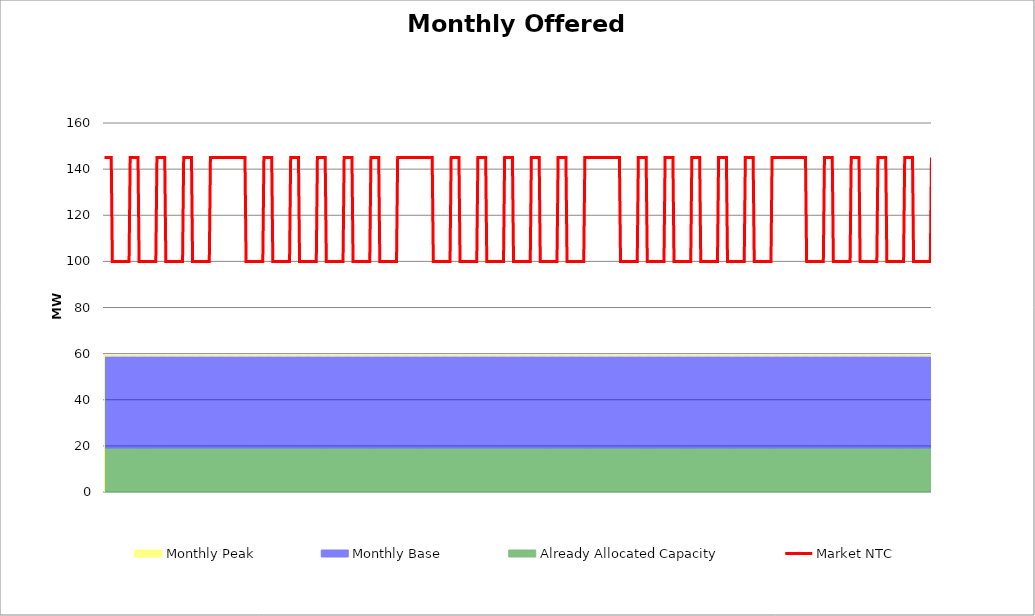
| Category | Market NTC |
|---|---|
| 0 | 145 |
| 1 | 145 |
| 2 | 145 |
| 3 | 145 |
| 4 | 145 |
| 5 | 145 |
| 6 | 145 |
| 7 | 100 |
| 8 | 100 |
| 9 | 100 |
| 10 | 100 |
| 11 | 100 |
| 12 | 100 |
| 13 | 100 |
| 14 | 100 |
| 15 | 100 |
| 16 | 100 |
| 17 | 100 |
| 18 | 100 |
| 19 | 100 |
| 20 | 100 |
| 21 | 100 |
| 22 | 100 |
| 23 | 145 |
| 24 | 145 |
| 25 | 145 |
| 26 | 145 |
| 27 | 145 |
| 28 | 145 |
| 29 | 145 |
| 30 | 145 |
| 31 | 100 |
| 32 | 100 |
| 33 | 100 |
| 34 | 100 |
| 35 | 100 |
| 36 | 100 |
| 37 | 100 |
| 38 | 100 |
| 39 | 100 |
| 40 | 100 |
| 41 | 100 |
| 42 | 100 |
| 43 | 100 |
| 44 | 100 |
| 45 | 100 |
| 46 | 100 |
| 47 | 145 |
| 48 | 145 |
| 49 | 145 |
| 50 | 145 |
| 51 | 145 |
| 52 | 145 |
| 53 | 145 |
| 54 | 145 |
| 55 | 100 |
| 56 | 100 |
| 57 | 100 |
| 58 | 100 |
| 59 | 100 |
| 60 | 100 |
| 61 | 100 |
| 62 | 100 |
| 63 | 100 |
| 64 | 100 |
| 65 | 100 |
| 66 | 100 |
| 67 | 100 |
| 68 | 100 |
| 69 | 100 |
| 70 | 100 |
| 71 | 145 |
| 72 | 145 |
| 73 | 145 |
| 74 | 145 |
| 75 | 145 |
| 76 | 145 |
| 77 | 145 |
| 78 | 145 |
| 79 | 100 |
| 80 | 100 |
| 81 | 100 |
| 82 | 100 |
| 83 | 100 |
| 84 | 100 |
| 85 | 100 |
| 86 | 100 |
| 87 | 100 |
| 88 | 100 |
| 89 | 100 |
| 90 | 100 |
| 91 | 100 |
| 92 | 100 |
| 93 | 100 |
| 94 | 100 |
| 95 | 145 |
| 96 | 145 |
| 97 | 145 |
| 98 | 145 |
| 99 | 145 |
| 100 | 145 |
| 101 | 145 |
| 102 | 145 |
| 103 | 145 |
| 104 | 145 |
| 105 | 145 |
| 106 | 145 |
| 107 | 145 |
| 108 | 145 |
| 109 | 145 |
| 110 | 145 |
| 111 | 145 |
| 112 | 145 |
| 113 | 145 |
| 114 | 145 |
| 115 | 145 |
| 116 | 145 |
| 117 | 145 |
| 118 | 145 |
| 119 | 145 |
| 120 | 145 |
| 121 | 145 |
| 122 | 145 |
| 123 | 145 |
| 124 | 145 |
| 125 | 145 |
| 126 | 145 |
| 127 | 100 |
| 128 | 100 |
| 129 | 100 |
| 130 | 100 |
| 131 | 100 |
| 132 | 100 |
| 133 | 100 |
| 134 | 100 |
| 135 | 100 |
| 136 | 100 |
| 137 | 100 |
| 138 | 100 |
| 139 | 100 |
| 140 | 100 |
| 141 | 100 |
| 142 | 100 |
| 143 | 145 |
| 144 | 145 |
| 145 | 145 |
| 146 | 145 |
| 147 | 145 |
| 148 | 145 |
| 149 | 145 |
| 150 | 145 |
| 151 | 100 |
| 152 | 100 |
| 153 | 100 |
| 154 | 100 |
| 155 | 100 |
| 156 | 100 |
| 157 | 100 |
| 158 | 100 |
| 159 | 100 |
| 160 | 100 |
| 161 | 100 |
| 162 | 100 |
| 163 | 100 |
| 164 | 100 |
| 165 | 100 |
| 166 | 100 |
| 167 | 145 |
| 168 | 145 |
| 169 | 145 |
| 170 | 145 |
| 171 | 145 |
| 172 | 145 |
| 173 | 145 |
| 174 | 145 |
| 175 | 100 |
| 176 | 100 |
| 177 | 100 |
| 178 | 100 |
| 179 | 100 |
| 180 | 100 |
| 181 | 100 |
| 182 | 100 |
| 183 | 100 |
| 184 | 100 |
| 185 | 100 |
| 186 | 100 |
| 187 | 100 |
| 188 | 100 |
| 189 | 100 |
| 190 | 100 |
| 191 | 145 |
| 192 | 145 |
| 193 | 145 |
| 194 | 145 |
| 195 | 145 |
| 196 | 145 |
| 197 | 145 |
| 198 | 145 |
| 199 | 100 |
| 200 | 100 |
| 201 | 100 |
| 202 | 100 |
| 203 | 100 |
| 204 | 100 |
| 205 | 100 |
| 206 | 100 |
| 207 | 100 |
| 208 | 100 |
| 209 | 100 |
| 210 | 100 |
| 211 | 100 |
| 212 | 100 |
| 213 | 100 |
| 214 | 100 |
| 215 | 145 |
| 216 | 145 |
| 217 | 145 |
| 218 | 145 |
| 219 | 145 |
| 220 | 145 |
| 221 | 145 |
| 222 | 145 |
| 223 | 100 |
| 224 | 100 |
| 225 | 100 |
| 226 | 100 |
| 227 | 100 |
| 228 | 100 |
| 229 | 100 |
| 230 | 100 |
| 231 | 100 |
| 232 | 100 |
| 233 | 100 |
| 234 | 100 |
| 235 | 100 |
| 236 | 100 |
| 237 | 100 |
| 238 | 100 |
| 239 | 145 |
| 240 | 145 |
| 241 | 145 |
| 242 | 145 |
| 243 | 145 |
| 244 | 145 |
| 245 | 145 |
| 246 | 145 |
| 247 | 100 |
| 248 | 100 |
| 249 | 100 |
| 250 | 100 |
| 251 | 100 |
| 252 | 100 |
| 253 | 100 |
| 254 | 100 |
| 255 | 100 |
| 256 | 100 |
| 257 | 100 |
| 258 | 100 |
| 259 | 100 |
| 260 | 100 |
| 261 | 100 |
| 262 | 100 |
| 263 | 145 |
| 264 | 145 |
| 265 | 145 |
| 266 | 145 |
| 267 | 145 |
| 268 | 145 |
| 269 | 145 |
| 270 | 145 |
| 271 | 145 |
| 272 | 145 |
| 273 | 145 |
| 274 | 145 |
| 275 | 145 |
| 276 | 145 |
| 277 | 145 |
| 278 | 145 |
| 279 | 145 |
| 280 | 145 |
| 281 | 145 |
| 282 | 145 |
| 283 | 145 |
| 284 | 145 |
| 285 | 145 |
| 286 | 145 |
| 287 | 145 |
| 288 | 145 |
| 289 | 145 |
| 290 | 145 |
| 291 | 145 |
| 292 | 145 |
| 293 | 145 |
| 294 | 145 |
| 295 | 100 |
| 296 | 100 |
| 297 | 100 |
| 298 | 100 |
| 299 | 100 |
| 300 | 100 |
| 301 | 100 |
| 302 | 100 |
| 303 | 100 |
| 304 | 100 |
| 305 | 100 |
| 306 | 100 |
| 307 | 100 |
| 308 | 100 |
| 309 | 100 |
| 310 | 100 |
| 311 | 145 |
| 312 | 145 |
| 313 | 145 |
| 314 | 145 |
| 315 | 145 |
| 316 | 145 |
| 317 | 145 |
| 318 | 145 |
| 319 | 100 |
| 320 | 100 |
| 321 | 100 |
| 322 | 100 |
| 323 | 100 |
| 324 | 100 |
| 325 | 100 |
| 326 | 100 |
| 327 | 100 |
| 328 | 100 |
| 329 | 100 |
| 330 | 100 |
| 331 | 100 |
| 332 | 100 |
| 333 | 100 |
| 334 | 100 |
| 335 | 145 |
| 336 | 145 |
| 337 | 145 |
| 338 | 145 |
| 339 | 145 |
| 340 | 145 |
| 341 | 145 |
| 342 | 145 |
| 343 | 100 |
| 344 | 100 |
| 345 | 100 |
| 346 | 100 |
| 347 | 100 |
| 348 | 100 |
| 349 | 100 |
| 350 | 100 |
| 351 | 100 |
| 352 | 100 |
| 353 | 100 |
| 354 | 100 |
| 355 | 100 |
| 356 | 100 |
| 357 | 100 |
| 358 | 100 |
| 359 | 145 |
| 360 | 145 |
| 361 | 145 |
| 362 | 145 |
| 363 | 145 |
| 364 | 145 |
| 365 | 145 |
| 366 | 145 |
| 367 | 100 |
| 368 | 100 |
| 369 | 100 |
| 370 | 100 |
| 371 | 100 |
| 372 | 100 |
| 373 | 100 |
| 374 | 100 |
| 375 | 100 |
| 376 | 100 |
| 377 | 100 |
| 378 | 100 |
| 379 | 100 |
| 380 | 100 |
| 381 | 100 |
| 382 | 100 |
| 383 | 145 |
| 384 | 145 |
| 385 | 145 |
| 386 | 145 |
| 387 | 145 |
| 388 | 145 |
| 389 | 145 |
| 390 | 145 |
| 391 | 100 |
| 392 | 100 |
| 393 | 100 |
| 394 | 100 |
| 395 | 100 |
| 396 | 100 |
| 397 | 100 |
| 398 | 100 |
| 399 | 100 |
| 400 | 100 |
| 401 | 100 |
| 402 | 100 |
| 403 | 100 |
| 404 | 100 |
| 405 | 100 |
| 406 | 100 |
| 407 | 145 |
| 408 | 145 |
| 409 | 145 |
| 410 | 145 |
| 411 | 145 |
| 412 | 145 |
| 413 | 145 |
| 414 | 145 |
| 415 | 100 |
| 416 | 100 |
| 417 | 100 |
| 418 | 100 |
| 419 | 100 |
| 420 | 100 |
| 421 | 100 |
| 422 | 100 |
| 423 | 100 |
| 424 | 100 |
| 425 | 100 |
| 426 | 100 |
| 427 | 100 |
| 428 | 100 |
| 429 | 100 |
| 430 | 100 |
| 431 | 145 |
| 432 | 145 |
| 433 | 145 |
| 434 | 145 |
| 435 | 145 |
| 436 | 145 |
| 437 | 145 |
| 438 | 145 |
| 439 | 145 |
| 440 | 145 |
| 441 | 145 |
| 442 | 145 |
| 443 | 145 |
| 444 | 145 |
| 445 | 145 |
| 446 | 145 |
| 447 | 145 |
| 448 | 145 |
| 449 | 145 |
| 450 | 145 |
| 451 | 145 |
| 452 | 145 |
| 453 | 145 |
| 454 | 145 |
| 455 | 145 |
| 456 | 145 |
| 457 | 145 |
| 458 | 145 |
| 459 | 145 |
| 460 | 145 |
| 461 | 145 |
| 462 | 145 |
| 463 | 100 |
| 464 | 100 |
| 465 | 100 |
| 466 | 100 |
| 467 | 100 |
| 468 | 100 |
| 469 | 100 |
| 470 | 100 |
| 471 | 100 |
| 472 | 100 |
| 473 | 100 |
| 474 | 100 |
| 475 | 100 |
| 476 | 100 |
| 477 | 100 |
| 478 | 100 |
| 479 | 145 |
| 480 | 145 |
| 481 | 145 |
| 482 | 145 |
| 483 | 145 |
| 484 | 145 |
| 485 | 145 |
| 486 | 145 |
| 487 | 100 |
| 488 | 100 |
| 489 | 100 |
| 490 | 100 |
| 491 | 100 |
| 492 | 100 |
| 493 | 100 |
| 494 | 100 |
| 495 | 100 |
| 496 | 100 |
| 497 | 100 |
| 498 | 100 |
| 499 | 100 |
| 500 | 100 |
| 501 | 100 |
| 502 | 100 |
| 503 | 145 |
| 504 | 145 |
| 505 | 145 |
| 506 | 145 |
| 507 | 145 |
| 508 | 145 |
| 509 | 145 |
| 510 | 145 |
| 511 | 100 |
| 512 | 100 |
| 513 | 100 |
| 514 | 100 |
| 515 | 100 |
| 516 | 100 |
| 517 | 100 |
| 518 | 100 |
| 519 | 100 |
| 520 | 100 |
| 521 | 100 |
| 522 | 100 |
| 523 | 100 |
| 524 | 100 |
| 525 | 100 |
| 526 | 100 |
| 527 | 145 |
| 528 | 145 |
| 529 | 145 |
| 530 | 145 |
| 531 | 145 |
| 532 | 145 |
| 533 | 145 |
| 534 | 145 |
| 535 | 100 |
| 536 | 100 |
| 537 | 100 |
| 538 | 100 |
| 539 | 100 |
| 540 | 100 |
| 541 | 100 |
| 542 | 100 |
| 543 | 100 |
| 544 | 100 |
| 545 | 100 |
| 546 | 100 |
| 547 | 100 |
| 548 | 100 |
| 549 | 100 |
| 550 | 100 |
| 551 | 145 |
| 552 | 145 |
| 553 | 145 |
| 554 | 145 |
| 555 | 145 |
| 556 | 145 |
| 557 | 145 |
| 558 | 145 |
| 559 | 100 |
| 560 | 100 |
| 561 | 100 |
| 562 | 100 |
| 563 | 100 |
| 564 | 100 |
| 565 | 100 |
| 566 | 100 |
| 567 | 100 |
| 568 | 100 |
| 569 | 100 |
| 570 | 100 |
| 571 | 100 |
| 572 | 100 |
| 573 | 100 |
| 574 | 100 |
| 575 | 145 |
| 576 | 145 |
| 577 | 145 |
| 578 | 145 |
| 579 | 145 |
| 580 | 145 |
| 581 | 145 |
| 582 | 145 |
| 583 | 100 |
| 584 | 100 |
| 585 | 100 |
| 586 | 100 |
| 587 | 100 |
| 588 | 100 |
| 589 | 100 |
| 590 | 100 |
| 591 | 100 |
| 592 | 100 |
| 593 | 100 |
| 594 | 100 |
| 595 | 100 |
| 596 | 100 |
| 597 | 100 |
| 598 | 100 |
| 599 | 145 |
| 600 | 145 |
| 601 | 145 |
| 602 | 145 |
| 603 | 145 |
| 604 | 145 |
| 605 | 145 |
| 606 | 145 |
| 607 | 145 |
| 608 | 145 |
| 609 | 145 |
| 610 | 145 |
| 611 | 145 |
| 612 | 145 |
| 613 | 145 |
| 614 | 145 |
| 615 | 145 |
| 616 | 145 |
| 617 | 145 |
| 618 | 145 |
| 619 | 145 |
| 620 | 145 |
| 621 | 145 |
| 622 | 145 |
| 623 | 145 |
| 624 | 145 |
| 625 | 145 |
| 626 | 145 |
| 627 | 145 |
| 628 | 145 |
| 629 | 145 |
| 630 | 100 |
| 631 | 100 |
| 632 | 100 |
| 633 | 100 |
| 634 | 100 |
| 635 | 100 |
| 636 | 100 |
| 637 | 100 |
| 638 | 100 |
| 639 | 100 |
| 640 | 100 |
| 641 | 100 |
| 642 | 100 |
| 643 | 100 |
| 644 | 100 |
| 645 | 100 |
| 646 | 145 |
| 647 | 145 |
| 648 | 145 |
| 649 | 145 |
| 650 | 145 |
| 651 | 145 |
| 652 | 145 |
| 653 | 145 |
| 654 | 100 |
| 655 | 100 |
| 656 | 100 |
| 657 | 100 |
| 658 | 100 |
| 659 | 100 |
| 660 | 100 |
| 661 | 100 |
| 662 | 100 |
| 663 | 100 |
| 664 | 100 |
| 665 | 100 |
| 666 | 100 |
| 667 | 100 |
| 668 | 100 |
| 669 | 100 |
| 670 | 145 |
| 671 | 145 |
| 672 | 145 |
| 673 | 145 |
| 674 | 145 |
| 675 | 145 |
| 676 | 145 |
| 677 | 145 |
| 678 | 100 |
| 679 | 100 |
| 680 | 100 |
| 681 | 100 |
| 682 | 100 |
| 683 | 100 |
| 684 | 100 |
| 685 | 100 |
| 686 | 100 |
| 687 | 100 |
| 688 | 100 |
| 689 | 100 |
| 690 | 100 |
| 691 | 100 |
| 692 | 100 |
| 693 | 100 |
| 694 | 145 |
| 695 | 145 |
| 696 | 145 |
| 697 | 145 |
| 698 | 145 |
| 699 | 145 |
| 700 | 145 |
| 701 | 145 |
| 702 | 100 |
| 703 | 100 |
| 704 | 100 |
| 705 | 100 |
| 706 | 100 |
| 707 | 100 |
| 708 | 100 |
| 709 | 100 |
| 710 | 100 |
| 711 | 100 |
| 712 | 100 |
| 713 | 100 |
| 714 | 100 |
| 715 | 100 |
| 716 | 100 |
| 717 | 100 |
| 718 | 145 |
| 719 | 145 |
| 720 | 145 |
| 721 | 145 |
| 722 | 145 |
| 723 | 145 |
| 724 | 145 |
| 725 | 145 |
| 726 | 100 |
| 727 | 100 |
| 728 | 100 |
| 729 | 100 |
| 730 | 100 |
| 731 | 100 |
| 732 | 100 |
| 733 | 100 |
| 734 | 100 |
| 735 | 100 |
| 736 | 100 |
| 737 | 100 |
| 738 | 100 |
| 739 | 100 |
| 740 | 100 |
| 741 | 100 |
| 742 | 145 |